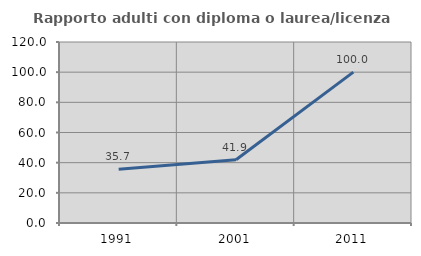
| Category | Rapporto adulti con diploma o laurea/licenza media  |
|---|---|
| 1991.0 | 35.714 |
| 2001.0 | 41.899 |
| 2011.0 | 100 |